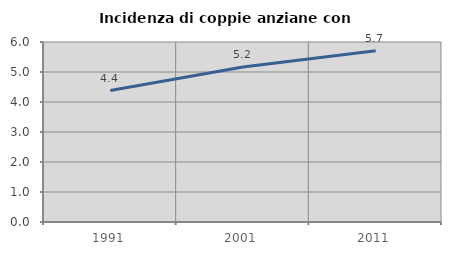
| Category | Incidenza di coppie anziane con figli |
|---|---|
| 1991.0 | 4.382 |
| 2001.0 | 5.164 |
| 2011.0 | 5.709 |